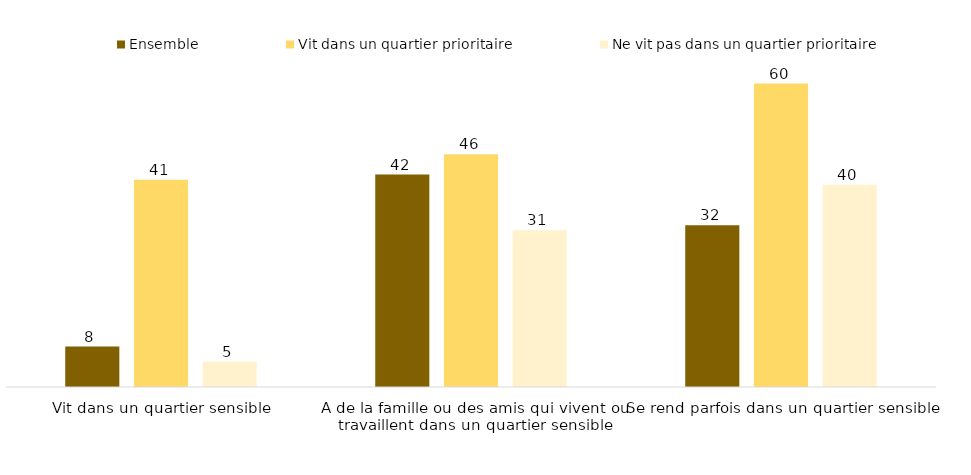
| Category | Ensemble | Vit dans un quartier prioritaire | Ne vit pas dans un quartier prioritaire |
|---|---|---|---|
| Vit dans un quartier sensible | 8 | 41 | 5 |
| A de la famille ou des amis qui vivent ou travaillent dans un quartier sensible | 42 | 46 | 31 |
| Se rend parfois dans un quartier sensible | 32 | 60 | 40 |